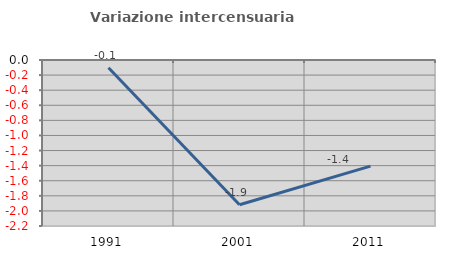
| Category | Variazione intercensuaria annua |
|---|---|
| 1991.0 | -0.103 |
| 2001.0 | -1.919 |
| 2011.0 | -1.407 |